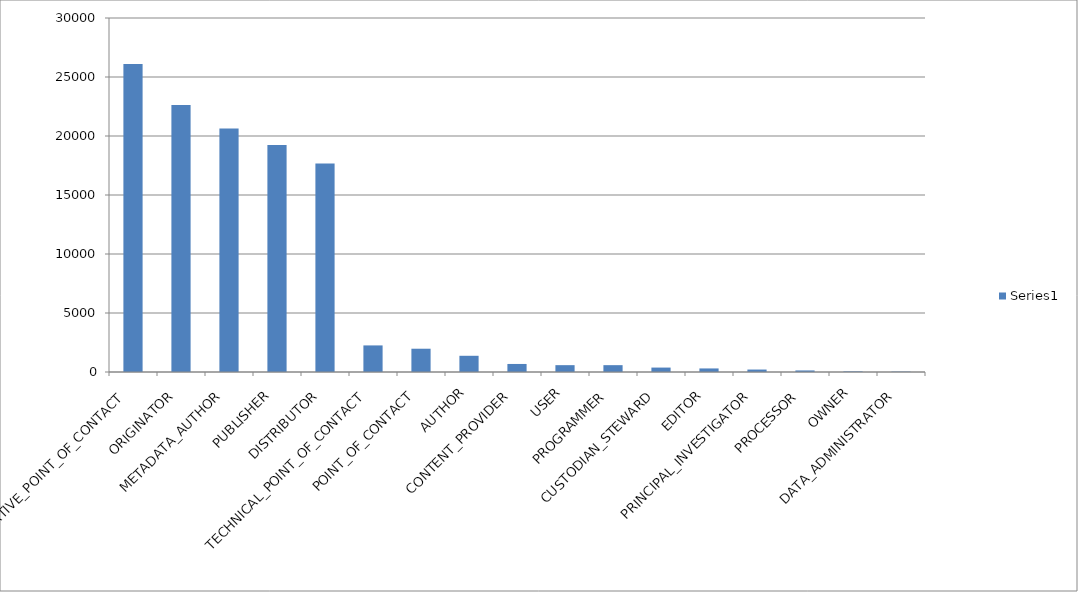
| Category | Series 0 |
|---|---|
| ADMINISTRATIVE_POINT_OF_CONTACT  | 26096 |
| ORIGINATOR  | 22623 |
| METADATA_AUTHOR  | 20644 |
| PUBLISHER  | 19237 |
| DISTRIBUTOR  | 17672 |
| TECHNICAL_POINT_OF_CONTACT  | 2253 |
| POINT_OF_CONTACT  | 1973 |
| AUTHOR  | 1374 |
| CONTENT_PROVIDER  | 681 |
| USER  | 580 |
| PROGRAMMER  | 580 |
| CUSTODIAN_STEWARD  | 375 |
| EDITOR  | 302 |
| PRINCIPAL_INVESTIGATOR  | 208 |
| PROCESSOR  | 132 |
| OWNER  | 48 |
| DATA_ADMINISTRATOR  | 31 |